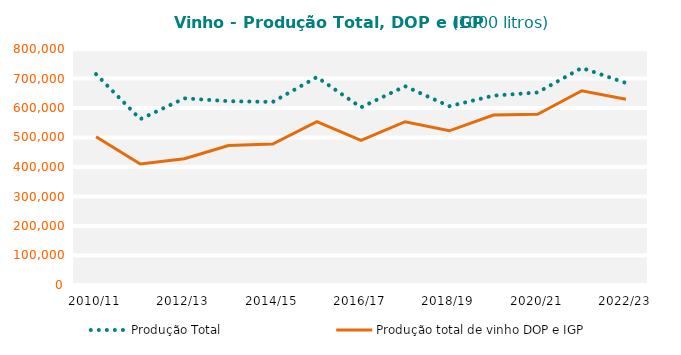
| Category | Produção Total | Produção total de vinho DOP e IGP |
|---|---|---|
| 2010/11 | 714792.682 | 502644.455 |
| 2011/12 | 562236.304 | 410251.626 |
| 2012/13 | 632710.682 | 427918.504 |
| 2013/14 | 623134.663 | 472900.037 |
| 2014/15 | 620575.61 | 477741.108 |
| 2015/16 | 704780.515 | 553785.207 |
| 2016/17 | 602196.79 | 490117.114 |
| 2017/18 | 673677.229 | 553477.341 |
| 2018/19 | 606124.297 | 522684.327 |
| 2019/20 | 641803.016 | 576063.098 |
| 2020/21 | 652656.227 | 578894.486 |
| 2021/22 | 735853.942 | 658533.424 |
| 2022/23 | 684841.386 | 629447.095 |